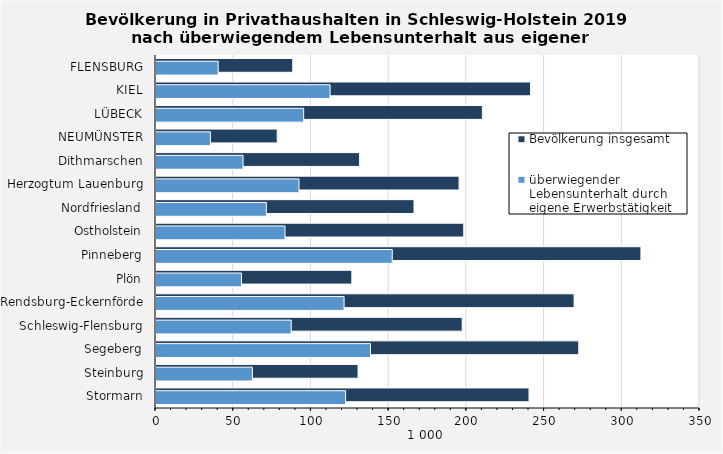
| Category | Bevölkerung insgesamt | überwiegender Lebensunterhalt durch eigene Erwerbstätigkeit |
|---|---|---|
| FLENSBURG | 88 | 40 |
| KIEL | 241 | 112 |
| LÜBECK | 210 | 95 |
| NEUMÜNSTER | 78 | 35 |
| Dithmarschen | 131 | 56 |
| Herzogtum Lauenburg | 195 | 92 |
| Nordfriesland | 166 | 71 |
| Ostholstein | 198 | 83 |
| Pinneberg | 312 | 152 |
| Plön | 126 | 55 |
| Rendsburg-Eckernförde | 269 | 121 |
| Schleswig-Flensburg | 197 | 87 |
| Segeberg | 272 | 138 |
| Steinburg | 130 | 62 |
| Stormarn | 240 | 122 |